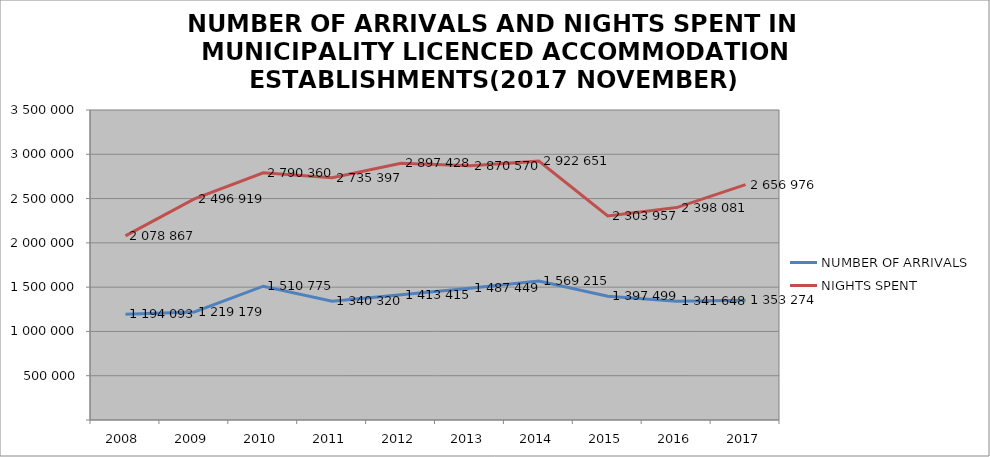
| Category | NUMBER OF ARRIVALS | NIGHTS SPENT |
|---|---|---|
| 2008 | 1194093 | 2078867 |
| 2009 | 1219179 | 2496919 |
| 2010 | 1510775 | 2790360 |
| 2011 | 1340320 | 2735397 |
| 2012 | 1413415 | 2897428 |
| 2013 | 1487449 | 2870570 |
| 2014 | 1569215 | 2922651 |
| 2015 | 1397499 | 2303957 |
| 2016 | 1341648 | 2398081 |
| 2017 | 1353274 | 2656976 |